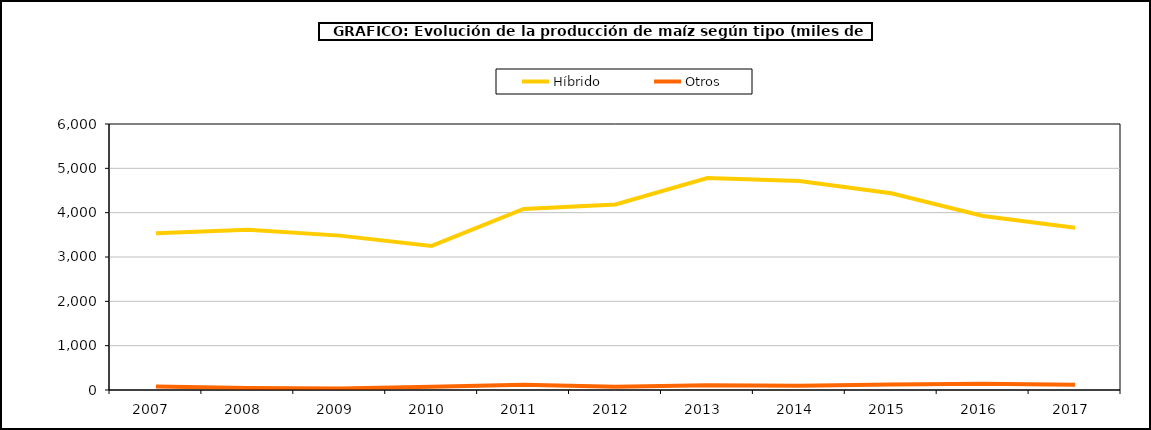
| Category | Híbrido | Otros |
|---|---|---|
| 2007  | 3534.026 | 76.911 |
| 2008  | 3615.117 | 45.316 |
| 2009  | 3482.098 | 33.519 |
| 2010  | 3250.084 | 74.737 |
| 2011  | 4084.167 | 115.76 |
| 2012  | 4186.073 | 75.996 |
| 2013  | 4779.482 | 108.979 |
| 2014  | 4715.168 | 95.477 |
| 2015  | 4439.372 | 125.044 |
| 2016  | 3925.755 | 143.753 |
| 2017  | 3659.487 | 116.158 |